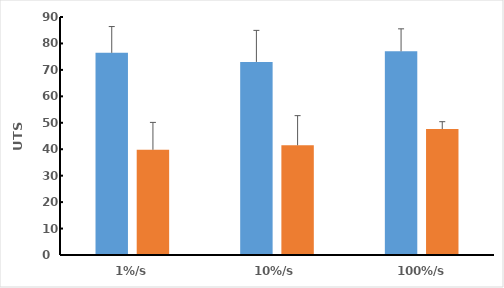
| Category | Native | Decellularised |
|---|---|---|
| 1%/s | 76.445 | 39.79 |
| 10%/s | 73.018 | 41.49 |
| 100%/s | 77.013 | 47.623 |